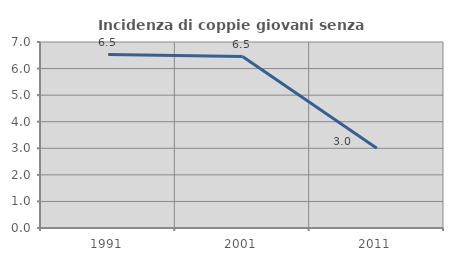
| Category | Incidenza di coppie giovani senza figli |
|---|---|
| 1991.0 | 6.527 |
| 2001.0 | 6.453 |
| 2011.0 | 3.002 |